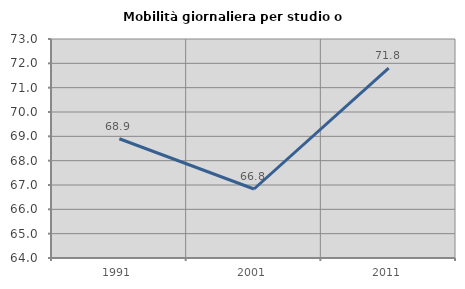
| Category | Mobilità giornaliera per studio o lavoro |
|---|---|
| 1991.0 | 68.9 |
| 2001.0 | 66.836 |
| 2011.0 | 71.801 |